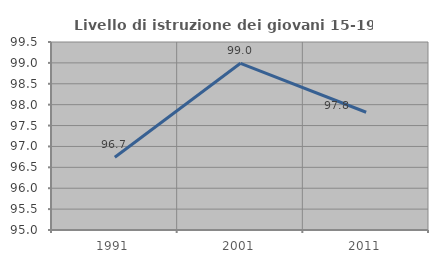
| Category | Livello di istruzione dei giovani 15-19 anni |
|---|---|
| 1991.0 | 96.743 |
| 2001.0 | 98.99 |
| 2011.0 | 97.819 |